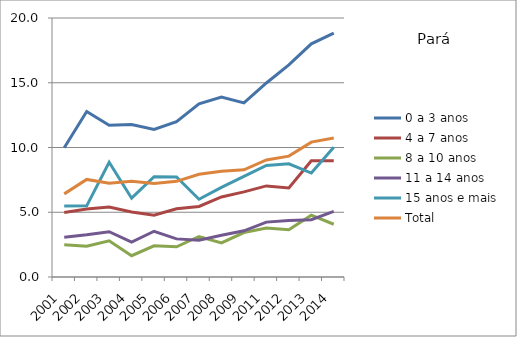
| Category | 0 a 3 anos | 4 a 7 anos | 8 a 10 anos | 11 a 14 anos | 15 anos e mais | Total |
|---|---|---|---|---|---|---|
| 2001.0 | 9.974 | 4.983 | 2.484 | 3.074 | 5.485 | 6.418 |
| 2002.0 | 12.783 | 5.243 | 2.369 | 3.257 | 5.496 | 7.533 |
| 2003.0 | 11.715 | 5.402 | 2.796 | 3.496 | 8.856 | 7.239 |
| 2004.0 | 11.776 | 5.021 | 1.646 | 2.69 | 6.086 | 7.389 |
| 2005.0 | 11.397 | 4.777 | 2.407 | 3.531 | 7.75 | 7.217 |
| 2006.0 | 11.998 | 5.269 | 2.328 | 2.943 | 7.731 | 7.388 |
| 2007.0 | 13.378 | 5.449 | 3.128 | 2.842 | 6.005 | 7.928 |
| 2008.0 | 13.9 | 6.183 | 2.633 | 3.227 | 6.923 | 8.165 |
| 2009.0 | 13.44 | 6.572 | 3.434 | 3.567 | 7.766 | 8.279 |
| 2011.0 | 14.981 | 7.034 | 3.79 | 4.237 | 8.616 | 9.036 |
| 2012.0 | 16.374 | 6.88 | 3.65 | 4.364 | 8.742 | 9.332 |
| 2013.0 | 18.007 | 8.978 | 4.774 | 4.427 | 8.027 | 10.415 |
| 2014.0 | 18.838 | 8.969 | 4.074 | 5.069 | 10.02 | 10.734 |